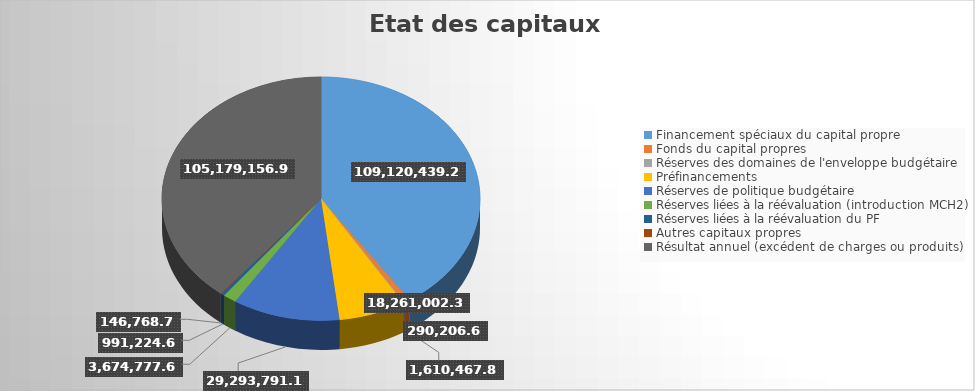
| Category | Series 0 |
|---|---|
| Financement spéciaux du capital propre | 109120439.26 |
| Fonds du capital propres | 1610467.83 |
| Réserves des domaines de l'enveloppe budgétaire | 290206.6 |
| Préfinancements | 18261002.34 |
| Réserves de politique budgétaire | 29293791.18 |
| Réserves liées à la réévaluation (introduction MCH2) | 3674777.68 |
| Réserves liées à la réévaluation du PF | 991224.68 |
| Autres capitaux propres | 146768.7 |
| Résultat annuel (excédent de charges ou produits) | 105179156.92 |